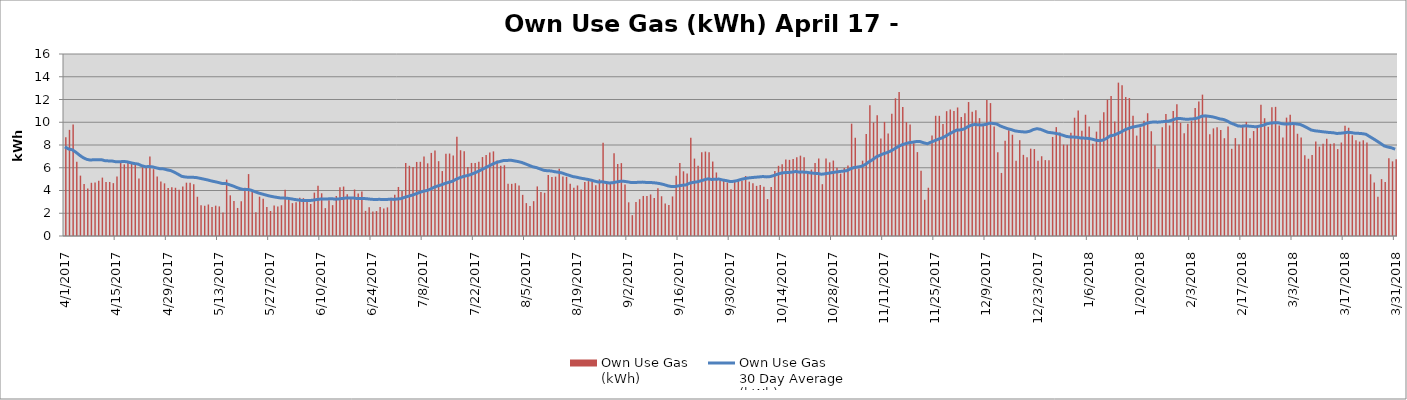
| Category | Own Use Gas
(kWh) |
|---|---|
| 4/1/17 | 8682165 |
| 4/2/17 | 9331284 |
| 4/3/17 | 9803268 |
| 4/4/17 | 6522456 |
| 4/5/17 | 5308444 |
| 4/6/17 | 4574965.468 |
| 4/7/17 | 4185630.308 |
| 4/8/17 | 4678154 |
| 4/9/17 | 4712056 |
| 4/10/17 | 4855861 |
| 4/11/17 | 5133806 |
| 4/12/17 | 4739093 |
| 4/13/17 | 4750306 |
| 4/14/17 | 4647711 |
| 4/15/17 | 5233078 |
| 4/16/17 | 6580577 |
| 4/17/17 | 6296954 |
| 4/18/17 | 6595116 |
| 4/19/17 | 6484550 |
| 4/20/17 | 6274554.435 |
| 4/21/17 | 5054861 |
| 4/22/17 | 6041652 |
| 4/23/17 | 5985516 |
| 4/24/17 | 6992431 |
| 4/25/17 | 5876600.474 |
| 4/26/17 | 5227556 |
| 4/27/17 | 4796483 |
| 4/28/17 | 4629508 |
| 4/29/17 | 4209511 |
| 4/30/17 | 4279745 |
| 5/1/17 | 4240627 |
| 5/2/17 | 4076014 |
| 5/3/17 | 4347289 |
| 5/4/17 | 4687241 |
| 5/5/17 | 4691790 |
| 5/6/17 | 4540174 |
| 5/7/17 | 3450058 |
| 5/8/17 | 2702530 |
| 5/9/17 | 2658476 |
| 5/10/17 | 2768983 |
| 5/11/17 | 2544526 |
| 5/12/17 | 2666564 |
| 5/13/17 | 2602268 |
| 5/14/17 | 2066764 |
| 5/15/17 | 4958949 |
| 5/16/17 | 3574852 |
| 5/17/17 | 3066138 |
| 5/18/17 | 2467531 |
| 5/19/17 | 3056959 |
| 5/20/17 | 4238677 |
| 5/21/17 | 5443051 |
| 5/22/17 | 3919568 |
| 5/23/17 | 2093820 |
| 5/24/17 | 3456167 |
| 5/25/17 | 3279431 |
| 5/26/17 | 2555183 |
| 5/27/17 | 2199724 |
| 5/28/17 | 2681507 |
| 5/29/17 | 2591097 |
| 5/30/17 | 2703404 |
| 5/31/17 | 4065192 |
| 6/1/17 | 3279845 |
| 6/2/17 | 2889420 |
| 6/3/17 | 2974141 |
| 6/4/17 | 3361889 |
| 6/5/17 | 3326778 |
| 6/6/17 | 3205549 |
| 6/7/17 | 2815893.041 |
| 6/8/17 | 3814823 |
| 6/9/17 | 4417464 |
| 6/10/17 | 3753714 |
| 6/11/17 | 2450599 |
| 6/12/17 | 3149443 |
| 6/13/17 | 2713101 |
| 6/14/17 | 3518540 |
| 6/15/17 | 4277992 |
| 6/16/17 | 4346564 |
| 6/17/17 | 3670735 |
| 6/18/17 | 3296919 |
| 6/19/17 | 4088963 |
| 6/20/17 | 3732231 |
| 6/21/17 | 3922658 |
| 6/22/17 | 2211479 |
| 6/23/17 | 2526118 |
| 6/24/17 | 2146556 |
| 6/25/17 | 2193114 |
| 6/26/17 | 2545344 |
| 6/27/17 | 2417397 |
| 6/28/17 | 2516898 |
| 6/29/17 | 3358135 |
| 6/30/17 | 3630267.563 |
| 7/1/17 | 4311273 |
| 7/2/17 | 3959977 |
| 7/3/17 | 6417046 |
| 7/4/17 | 6172546.227 |
| 7/5/17 | 6058287.075 |
| 7/6/17 | 6511240.528 |
| 7/7/17 | 6522943.246 |
| 7/8/17 | 6981284.343 |
| 7/9/17 | 6387897.36 |
| 7/10/17 | 7304741.38 |
| 7/11/17 | 7512800.461 |
| 7/12/17 | 6578156.834 |
| 7/13/17 | 5709310.795 |
| 7/14/17 | 7228888.824 |
| 7/15/17 | 7249705.636 |
| 7/16/17 | 7072522.44 |
| 7/17/17 | 8732824.728 |
| 7/18/17 | 7539636.828 |
| 7/19/17 | 7444744.414 |
| 7/20/17 | 6055441.731 |
| 7/21/17 | 6422418.57 |
| 7/22/17 | 6427707.625 |
| 7/23/17 | 6522152.977 |
| 7/24/17 | 6940070.809 |
| 7/25/17 | 7118265.505 |
| 7/26/17 | 7331879.505 |
| 7/27/17 | 7439735.322 |
| 7/28/17 | 6631911.511 |
| 7/29/17 | 6179883.975 |
| 7/30/17 | 6216664 |
| 7/31/17 | 4598461 |
| 8/1/17 | 4585395 |
| 8/2/17 | 4641230 |
| 8/3/17 | 4435596 |
| 8/4/17 | 3617532 |
| 8/5/17 | 2891912 |
| 8/6/17 | 2647414 |
| 8/7/17 | 3063735 |
| 8/8/17 | 4359491 |
| 8/9/17 | 3861834 |
| 8/10/17 | 3800999 |
| 8/11/17 | 5373426 |
| 8/12/17 | 5178660 |
| 8/13/17 | 5218925 |
| 8/14/17 | 5912716 |
| 8/15/17 | 5231402 |
| 8/16/17 | 5196619 |
| 8/17/17 | 4596569 |
| 8/18/17 | 4240679 |
| 8/19/17 | 4441987 |
| 8/20/17 | 4090962 |
| 8/21/17 | 4750322 |
| 8/22/17 | 4825778 |
| 8/23/17 | 4812144 |
| 8/24/17 | 4459078.781 |
| 8/25/17 | 4986326 |
| 8/26/17 | 8204003 |
| 8/27/17 | 4814059 |
| 8/28/17 | 4696388 |
| 8/29/17 | 7275235 |
| 8/30/17 | 6327291 |
| 8/31/17 | 6407025 |
| 9/1/17 | 4528644 |
| 9/2/17 | 2961078.273 |
| 9/3/17 | 1835338 |
| 9/4/17 | 2981196 |
| 9/5/17 | 3234794 |
| 9/6/17 | 3521846 |
| 9/7/17 | 3523617 |
| 9/8/17 | 3654311 |
| 9/9/17 | 3347625 |
| 9/10/17 | 4194901 |
| 9/11/17 | 3494965 |
| 9/12/17 | 2862398 |
| 9/13/17 | 2720745 |
| 9/14/17 | 3478044 |
| 9/15/17 | 5295733 |
| 9/16/17 | 6421291 |
| 9/17/17 | 5688754 |
| 9/18/17 | 5501834 |
| 9/19/17 | 8631447.876 |
| 9/20/17 | 6807004 |
| 9/21/17 | 6167315 |
| 9/22/17 | 7372178 |
| 9/23/17 | 7421468 |
| 9/24/17 | 7362006 |
| 9/25/17 | 6546678 |
| 9/26/17 | 5584117.506 |
| 9/27/17 | 4910627 |
| 9/28/17 | 4882938 |
| 9/29/17 | 4701247.959 |
| 9/30/17 | 4118518.447 |
| 10/1/17 | 4926977 |
| 10/2/17 | 4973772.92 |
| 10/3/17 | 4848208.104 |
| 10/4/17 | 5276497.628 |
| 10/5/17 | 4778877 |
| 10/6/17 | 4628265 |
| 10/7/17 | 4406849 |
| 10/8/17 | 4478107 |
| 10/9/17 | 4340521 |
| 10/10/17 | 3246215 |
| 10/11/17 | 4313042 |
| 10/12/17 | 5704385 |
| 10/13/17 | 6169448 |
| 10/14/17 | 6301979 |
| 10/15/17 | 6722701 |
| 10/16/17 | 6693165 |
| 10/17/17 | 6759595 |
| 10/18/17 | 6931916 |
| 10/19/17 | 7062367 |
| 10/20/17 | 6924731 |
| 10/21/17 | 5581457 |
| 10/22/17 | 5838606 |
| 10/23/17 | 6407356 |
| 10/24/17 | 6813638 |
| 10/25/17 | 4554669 |
| 10/26/17 | 6816365 |
| 10/27/17 | 6472189 |
| 10/28/17 | 6633534 |
| 10/29/17 | 5992895 |
| 10/30/17 | 5481550 |
| 10/31/17 | 5976382 |
| 11/1/17 | 6206232.999 |
| 11/2/17 | 9873949.622 |
| 11/3/17 | 8644265 |
| 11/4/17 | 5941367 |
| 11/5/17 | 6623334 |
| 11/6/17 | 8973846 |
| 11/7/17 | 11490737 |
| 11/8/17 | 9976354.463 |
| 11/9/17 | 10604563 |
| 11/10/17 | 8576017 |
| 11/11/17 | 10028830 |
| 11/12/17 | 9021934 |
| 11/13/17 | 10743682 |
| 11/14/17 | 12107281 |
| 11/15/17 | 12666265 |
| 11/16/17 | 11345952 |
| 11/17/17 | 10008739 |
| 11/18/17 | 9809366 |
| 11/19/17 | 8160283 |
| 11/20/17 | 7375380 |
| 11/21/17 | 5729583 |
| 11/22/17 | 3184902 |
| 11/23/17 | 4242656 |
| 11/24/17 | 8826594 |
| 11/25/17 | 10568715 |
| 11/26/17 | 10564904 |
| 11/27/17 | 9838264 |
| 11/28/17 | 10973466.314 |
| 11/29/17 | 11120952.193 |
| 11/30/17 | 10994892.271 |
| 12/1/17 | 11299267.025 |
| 12/2/17 | 10451036.551 |
| 12/3/17 | 10786405.038 |
| 12/4/17 | 11777189.869 |
| 12/5/17 | 10930655.479 |
| 12/6/17 | 11058535 |
| 12/7/17 | 10362098.015 |
| 12/8/17 | 9740105.059 |
| 12/9/17 | 11955551.912 |
| 12/10/17 | 11683645.065 |
| 12/11/17 | 9618115.555 |
| 12/12/17 | 7353711.625 |
| 12/13/17 | 5544401.607 |
| 12/14/17 | 8380247.829 |
| 12/15/17 | 9291271.676 |
| 12/16/17 | 8904616.876 |
| 12/17/17 | 6617120.352 |
| 12/18/17 | 8423421.91 |
| 12/19/17 | 7134425.691 |
| 12/20/17 | 6929672.277 |
| 12/21/17 | 7677763.207 |
| 12/22/17 | 7644235.198 |
| 12/23/17 | 6613764.107 |
| 12/24/17 | 7012396 |
| 12/25/17 | 6672448 |
| 12/26/17 | 6665246.97 |
| 12/27/17 | 8706561.121 |
| 12/28/17 | 9573526.38 |
| 12/29/17 | 9094795.005 |
| 12/30/17 | 8039331.81 |
| 12/31/17 | 8017747 |
| 1/1/18 | 9077502.737 |
| 1/2/18 | 10399703.365 |
| 1/3/18 | 11030706.759 |
| 1/4/18 | 9247075.387 |
| 1/5/18 | 10659247.809 |
| 1/6/18 | 9627291.601 |
| 1/7/18 | 8114980.107 |
| 1/8/18 | 9176814.51 |
| 1/9/18 | 10147841.176 |
| 1/10/18 | 10873159.497 |
| 1/11/18 | 11978914.909 |
| 1/12/18 | 12306168.037 |
| 1/13/18 | 10072436 |
| 1/14/18 | 13481917 |
| 1/15/18 | 13248819.149 |
| 1/16/18 | 12217253.179 |
| 1/17/18 | 12126736.715 |
| 1/18/18 | 10577535.449 |
| 1/19/18 | 8824869.836 |
| 1/20/18 | 9542872.159 |
| 1/21/18 | 10121867 |
| 1/22/18 | 10792594 |
| 1/23/18 | 9210386 |
| 1/24/18 | 7980704.342 |
| 1/25/18 | 5917999.73 |
| 1/26/18 | 9551510.687 |
| 1/27/18 | 10716546.795 |
| 1/28/18 | 9719218.965 |
| 1/29/18 | 10981544.202 |
| 1/30/18 | 11581835.377 |
| 1/31/18 | 9946620.405 |
| 2/1/18 | 9031826.754 |
| 2/2/18 | 9874428.371 |
| 2/3/18 | 10136099.791 |
| 2/4/18 | 11250989.853 |
| 2/5/18 | 11815740.927 |
| 2/6/18 | 12428403.014 |
| 2/7/18 | 10458950.953 |
| 2/8/18 | 8934189 |
| 2/9/18 | 9459367 |
| 2/10/18 | 9567815 |
| 2/11/18 | 9310121 |
| 2/12/18 | 8597080 |
| 2/13/18 | 9627317 |
| 2/14/18 | 7665634.838 |
| 2/15/18 | 8606188.049 |
| 2/16/18 | 8038661 |
| 2/17/18 | 9777805 |
| 2/18/18 | 10032171 |
| 2/19/18 | 8602234.753 |
| 2/20/18 | 9227045.927 |
| 2/21/18 | 9730268.056 |
| 2/22/18 | 11532201.642 |
| 2/23/18 | 10354050 |
| 2/24/18 | 9607482 |
| 2/25/18 | 11324207 |
| 2/26/18 | 11354055 |
| 2/27/18 | 9711121 |
| 2/28/18 | 8668424.773 |
| 3/1/18 | 10407448.314 |
| 3/2/18 | 10662504.605 |
| 3/3/18 | 9755869.663 |
| 3/4/18 | 8988237.407 |
| 3/5/18 | 8652172.802 |
| 3/6/18 | 7094172 |
| 3/7/18 | 6791071.136 |
| 3/8/18 | 7127677.238 |
| 3/9/18 | 8305758 |
| 3/10/18 | 7856172 |
| 3/11/18 | 8106540 |
| 3/12/18 | 8554622 |
| 3/13/18 | 8101050 |
| 3/14/18 | 8158020 |
| 3/15/18 | 7639815 |
| 3/16/18 | 8216900 |
| 3/17/18 | 9698904 |
| 3/18/18 | 9518595 |
| 3/19/18 | 8860183 |
| 3/20/18 | 8406899 |
| 3/21/18 | 8298992 |
| 3/22/18 | 8414581 |
| 3/23/18 | 8213466 |
| 3/24/18 | 5427500 |
| 3/25/18 | 4706018 |
| 3/26/18 | 3455637.351 |
| 3/27/18 | 5000670.724 |
| 3/28/18 | 4758106 |
| 3/29/18 | 6843510 |
| 3/30/18 | 6562245 |
| 3/31/18 | 6755937 |